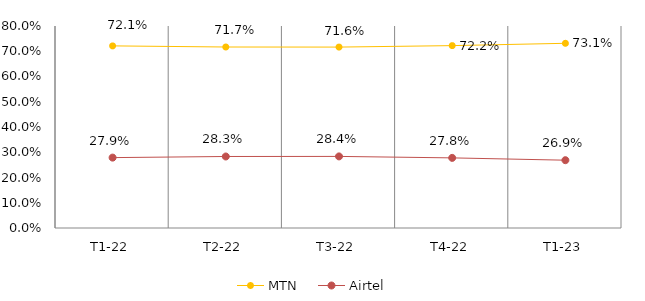
| Category | MTN | Airtel |
|---|---|---|
| T1-22 | 0.721 | 0.279 |
| T2-22 | 0.717 | 0.283 |
| T3-22 | 0.716 | 0.284 |
| T4-22 | 0.722 | 0.278 |
| T1-23 | 0.731 | 0.269 |